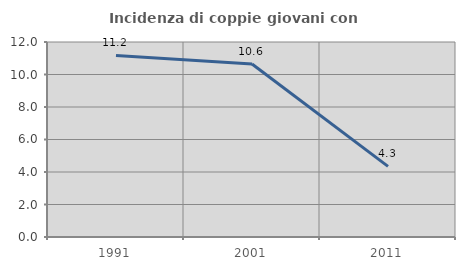
| Category | Incidenza di coppie giovani con figli |
|---|---|
| 1991.0 | 11.175 |
| 2001.0 | 10.644 |
| 2011.0 | 4.348 |